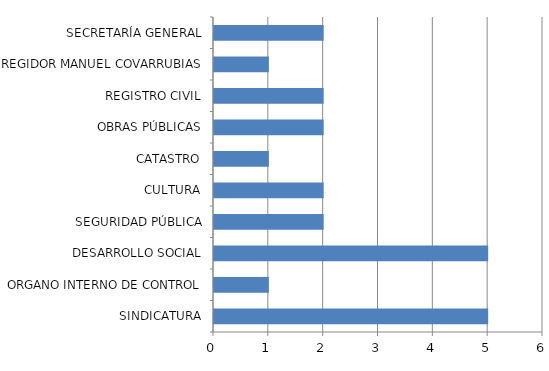
| Category | Series 0 |
|---|---|
| SINDICATURA | 5 |
| ORGANO INTERNO DE CONTROL | 1 |
| DESARROLLO SOCIAL | 5 |
| SEGURIDAD PÚBLICA | 2 |
| CULTURA | 2 |
| CATASTRO | 1 |
| OBRAS PÚBLICAS | 2 |
| REGISTRO CIVIL | 2 |
| REGIDOR MANUEL COVARRUBIAS | 1 |
| SECRETARÍA GENERAL | 2 |